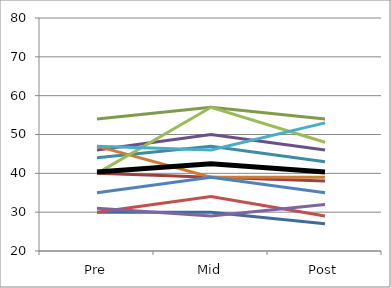
| Category | Series 0 | Series 1 | Series 2 | Series 3 | Series 4 | Series 5 | Series 6 | Series 7 | Series 8 | Series 9 | Series 10 | Mean |
|---|---|---|---|---|---|---|---|---|---|---|---|---|
| Pre | 30 | 40 | 54 | 46 | 44 | 47 | 35 | 30 | 40 | 31 | 47 | 40.364 |
| Mid | 30 | 39 | 57 | 50 | 47 | 39 | 39 | 34 | 57 | 29 | 46 | 42.455 |
| Post | 27 | 38 | 54 | 46 | 43 | 39 | 35 | 29 | 48 | 32 | 53 | 40.364 |